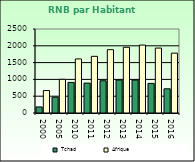
| Category | Tchad | Afrique                        |
|---|---|---|
| 2000.0 | 180 | 668.557 |
| 2005.0 | 470 | 1002.896 |
| 2010.0 | 910 | 1608.999 |
| 2011.0 | 890 | 1686.521 |
| 2012.0 | 960 | 1885.129 |
| 2013.0 | 980 | 1956.671 |
| 2014.0 | 980 | 2022.289 |
| 2015.0 | 880 | 1932.283 |
| 2016.0 | 720 | 1781.415 |